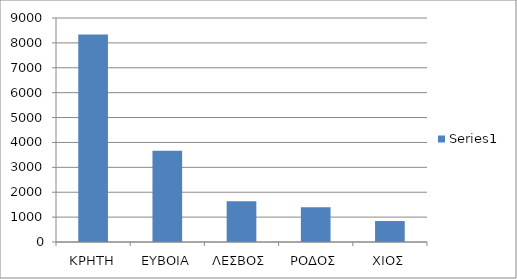
| Category | Series 0 |
|---|---|
| ΚΡΗΤΗ | 8336 |
| ΕΥΒΟΙΑ | 3670 |
| ΛΕΣΒΟΣ | 1633 |
| ΡΟΔΟΣ | 1401 |
| ΧΙΟΣ | 842 |